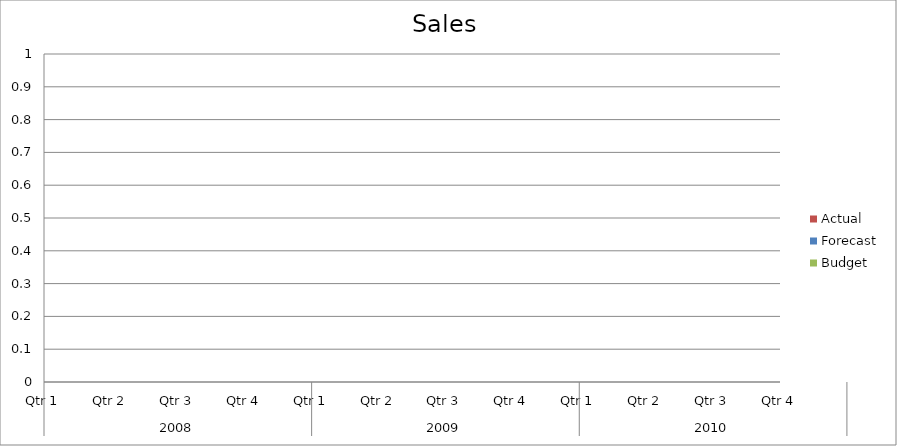
| Category | Budget | Forecast | Actual |
|---|---|---|---|
| 0 | 610 | 560 | 3410 |
| 1 | 2620 | 2460 | 570 |
| 2 | 2620 | 1040 | 3230 |
| 3 | 3170 | 2660 | 2840 |
| 4 | 3090 | 3100 | 3370 |
| 5 | 640 | 1320 | 1130 |
| 6 | 1830 | 2590 | 2350 |
| 7 | 2820 | 2150 | 630 |
| 8 | 2840 | 680 | 2940 |
| 9 | 1390 | 2210 | 1940 |
| 10 | 1860 | 1590 | 2200 |
| 11 | 3250 | 2880 | 750 |